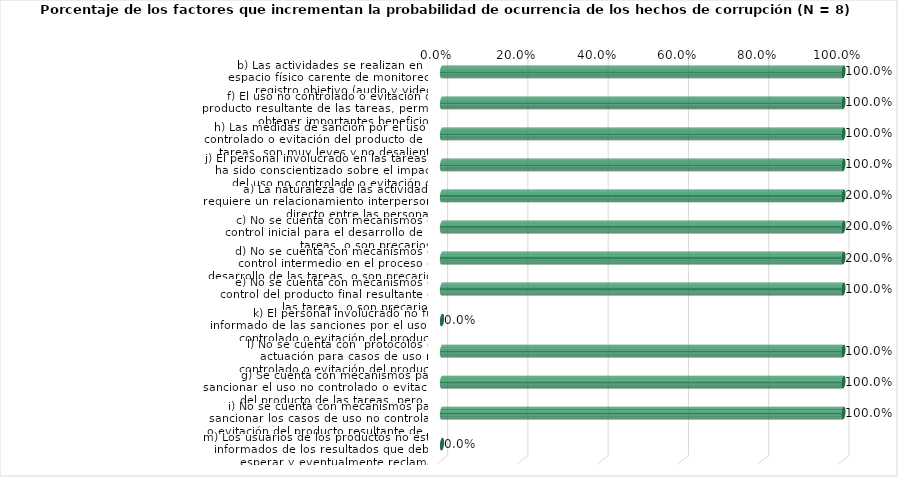
| Category | Series 0 |
|---|---|
| b) Las actividades se realizan en un espacio físico carente de monitoreo o registro objetivo (audio y video). | 1 |
| f) El uso no controlado o evitación del producto resultante de las tareas, permite obtener importantes beneficios. | 1 |
| h) Las medidas de sanción por el uso no controlado o evitación del producto de las tareas, son muy leves y no desalientan dichas conductas. | 1 |
| j) El personal involucrado en las tareas no ha sido conscientizado sobre el impacto del uso no controlado o evitación del producto resultante. | 1 |
| a) La naturaleza de las actividades requiere un relacionamiento interpersonal directo entre las personas. | 2 |
| c) No se cuenta con mecanismos de control inicial para el desarrollo de las tareas, o son precarios.  | 2 |
| d) No se cuenta con mecanismos de control intermedio en el proceso de desarrollo de las tareas, o son precarios.  | 2 |
| e) No se cuenta con mecanismos de control del producto final resultante de las tareas, o son precarios.  | 1 |
| k) El personal involucrado no fue informado de las sanciones por el uso no controlado o evitación del producto resultante. | 0 |
| l) No se cuenta con  protocolos de actuación para casos de uso no controlado o evitación del producto resultante de las tareas. | 1 |
| g) Se cuenta con mecanismos para sancionar el uso no controlado o evitación del producto de las tareas, pero las medidas no se aplican. | 1 |
| i) No se cuenta con mecanismos para sancionar los casos de uso no controlado o evitación del producto resultante de las tareas.  | 1 |
| m) Los usuarios de los productos no están informados de los resultados que deben esperar y eventualmente reclamar. | 0 |